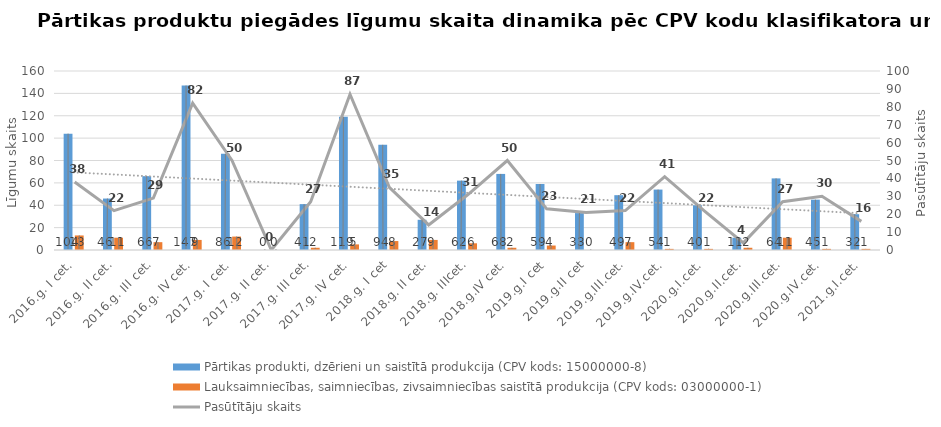
| Category | Pārtikas produkti, dzērieni un saistītā produkcija (CPV kods: 15000000-8) | Lauksaimniecības, saimniecības, zivsaimniecības saistītā produkcija (CPV kods: 03000000-1) |
|---|---|---|
| 2016.g. I cet. | 104 | 13 |
| 2016.g. II cet. | 46 | 11 |
| 2016.g. III cet. | 66 | 7 |
| 2016.g. IV cet. | 147 | 9 |
| 2017.g. I cet. | 86 | 12 |
| 2017.g. II cet. | 0 | 0 |
| 2017.g. III cet. | 41 | 2 |
| 2017.g. IV cet. | 119 | 5 |
| 2018.g. I cet | 94 | 8 |
| 2018.g. II cet. | 27 | 9 |
| 2018.g. IIIcet. | 62 | 6 |
| 2018.g.IV cet. | 68 | 2 |
| 2019.g.I cet | 59 | 4 |
| 2019.g.II cet | 33 | 0 |
| 2019.g.III.cet. | 49 | 7 |
| 2019.g.IV.cet. | 54 | 1 |
| 2020.g.I.cet. | 40 | 1 |
| 2020.g.II.cet. | 11 | 2 |
| 2020.g.III.cet. | 64 | 11 |
| 2020.g.IV.cet. | 45 | 1 |
| 2021.g.I.cet. | 32 | 1 |